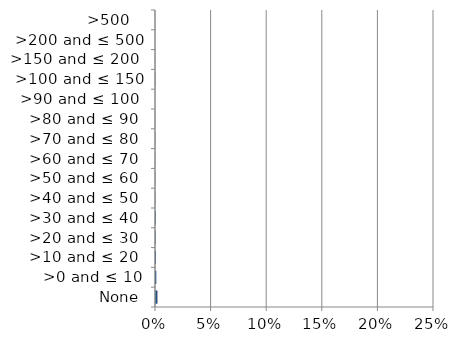
| Category | England | Scotland | Wales |
|---|---|---|---|
|  None | 0 | 0.002 | 0 |
| >0 and ≤ 10 | 0 | 0.001 | 0 |
| >10 and ≤ 20  | 0 | 0.001 | 0 |
| >20 and ≤ 30  | 0 | 0 | 0 |
| >30 and ≤ 40  | 0 | 0.001 | 0 |
| >40 and ≤ 50  | 0 | 0 | 0 |
| >50 and ≤ 60  | 0 | 0 | 0 |
| >60 and ≤ 70  | 0 | 0 | 0 |
| >70 and ≤ 80  | 0 | 0 | 0 |
| >80 and ≤ 90  | 0 | 0 | 0 |
| >90 and ≤ 100  | 0 | 0 | 0 |
| >100 and ≤ 150 | 0 | 0 | 0 |
| >150 and ≤ 200  | 0 | 0 | 0 |
| >200 and ≤ 500 | 0 | 0 | 0 |
| >500   | 0 | 0 | 0 |